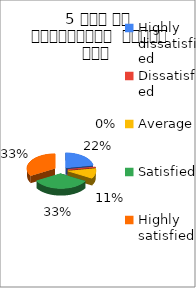
| Category | 5 समय पर पाठ्यक्रम  पूर्ण हुआ  |
|---|---|
| Highly dissatisfied | 2 |
| Dissatisfied | 0 |
| Average | 1 |
| Satisfied | 3 |
| Highly satisfied | 3 |